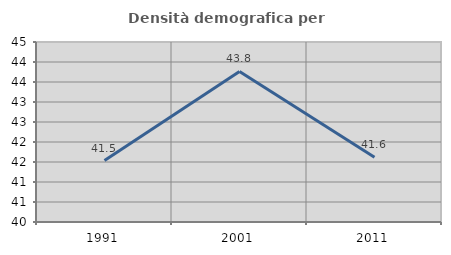
| Category | Densità demografica |
|---|---|
| 1991.0 | 41.537 |
| 2001.0 | 43.765 |
| 2011.0 | 41.616 |